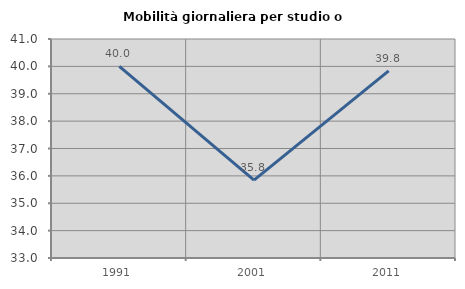
| Category | Mobilità giornaliera per studio o lavoro |
|---|---|
| 1991.0 | 40 |
| 2001.0 | 35.842 |
| 2011.0 | 39.834 |